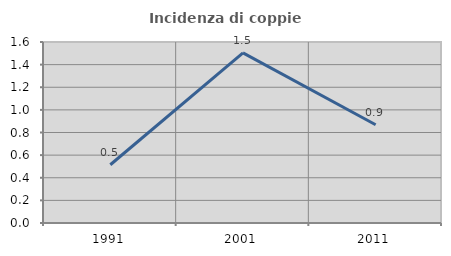
| Category | Incidenza di coppie miste |
|---|---|
| 1991.0 | 0.515 |
| 2001.0 | 1.504 |
| 2011.0 | 0.868 |